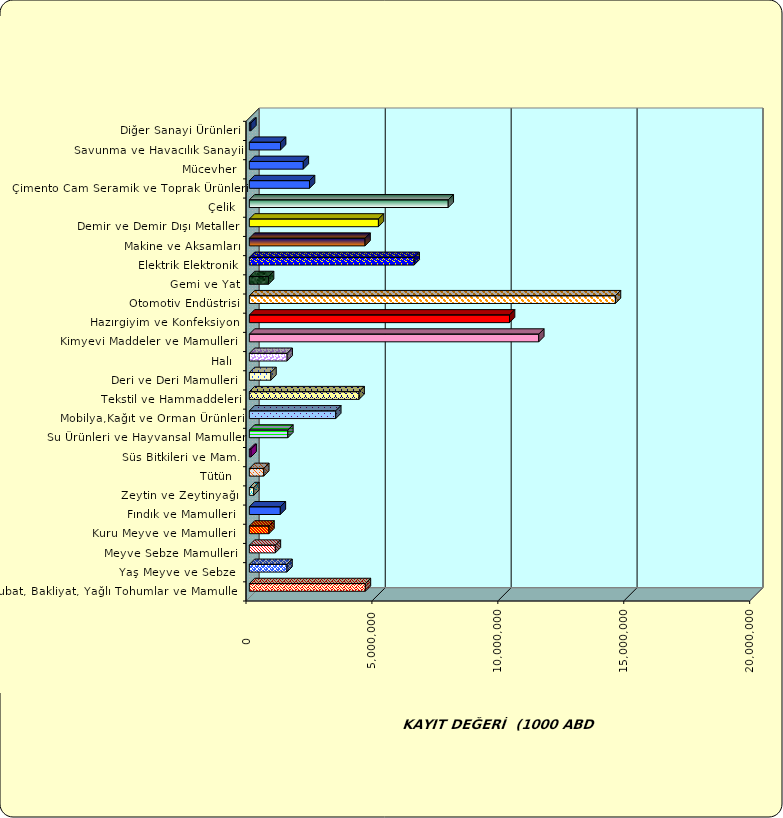
| Category | Series 0 |
|---|---|
|  Hububat, Bakliyat, Yağlı Tohumlar ve Mamulleri  | 4607116 |
|  Yaş Meyve ve Sebze   | 1494080.639 |
|  Meyve Sebze Mamulleri  | 1032401.413 |
|  Kuru Meyve ve Mamulleri   | 779445.439 |
|  Fındık ve Mamulleri  | 1230038.553 |
|  Zeytin ve Zeytinyağı  | 174912.338 |
|  Tütün  | 572077.929 |
|  Süs Bitkileri ve Mam. | 68156.384 |
|  Su Ürünleri ve Hayvansal Mamuller | 1527414.461 |
|  Mobilya,Kağıt ve Orman Ürünleri | 3430096.584 |
|  Tekstil ve Hammaddeleri | 4356812.914 |
|  Deri ve Deri Mamulleri  | 856472.983 |
|  Halı  | 1500405.756 |
|  Kimyevi Maddeler ve Mamulleri   | 11492274.51 |
|  Hazırgiyim ve Konfeksiyon  | 10330733.324 |
|  Otomotiv Endüstrisi | 14536621.257 |
|  Gemi ve Yat | 761936.192 |
|  Elektrik Elektronik | 6543073.651 |
|  Makine ve Aksamları | 4593672.252 |
|  Demir ve Demir Dışı Metaller  | 5126180.95 |
|  Çelik | 7897198.226 |
|  Çimento Cam Seramik ve Toprak Ürünleri | 2388590.747 |
|  Mücevher | 2142155.28 |
|  Savunma ve Havacılık Sanayii | 1239940.568 |
|  Diğer Sanayi Ürünleri | 60352.656 |